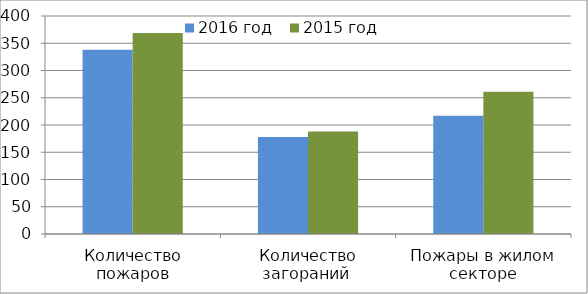
| Category | 2016 год | 2015 год |
|---|---|---|
| Количество пожаров | 338 | 369 |
| Количество загораний  | 178 | 188 |
| Пожары в жилом секторе | 217 | 261 |